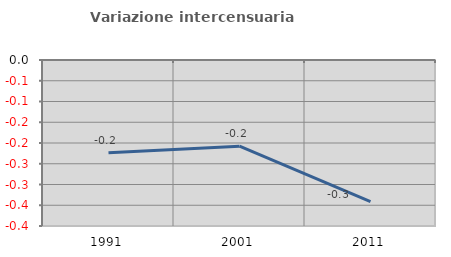
| Category | Variazione intercensuaria annua |
|---|---|
| 1991.0 | -0.224 |
| 2001.0 | -0.208 |
| 2011.0 | -0.341 |